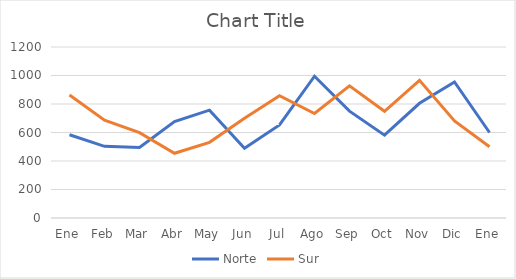
| Category | Norte | Sur |
|---|---|---|
| Ene | 584 | 863 |
| Feb | 503 | 686 |
| Mar | 495 | 599 |
| Abr | 677 | 454 |
| May | 757 | 531 |
| Jun | 490 | 700 |
| Jul | 653 | 858 |
| Ago | 995 | 733 |
| Sep | 750 | 928 |
| Oct | 581 | 749 |
| Nov | 805 | 966 |
| Dic | 955 | 681 |
| Ene | 600 | 500 |